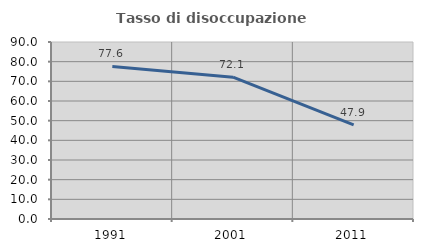
| Category | Tasso di disoccupazione giovanile  |
|---|---|
| 1991.0 | 77.577 |
| 2001.0 | 72.121 |
| 2011.0 | 47.869 |